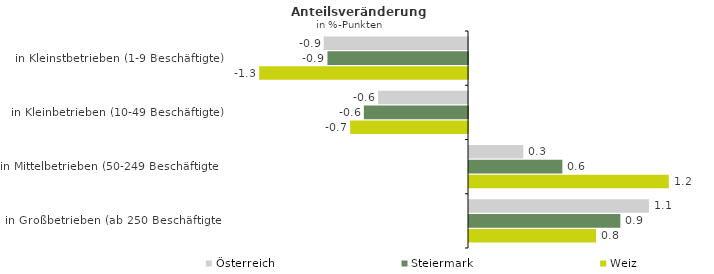
| Category | Österreich | Steiermark | Weiz |
|---|---|---|---|
| in Kleinstbetrieben (1-9 Beschäftigte) | -0.898 | -0.875 | -1.3 |
| in Kleinbetrieben (10-49 Beschäftigte) | -0.559 | -0.648 | -0.734 |
| in Mittelbetrieben (50-249 Beschäftigte) | 0.338 | 0.581 | 1.244 |
| in Großbetrieben (ab 250 Beschäftigte) | 1.12 | 0.942 | 0.791 |